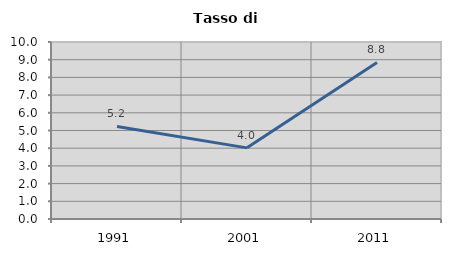
| Category | Tasso di disoccupazione   |
|---|---|
| 1991.0 | 5.23 |
| 2001.0 | 4.019 |
| 2011.0 | 8.845 |